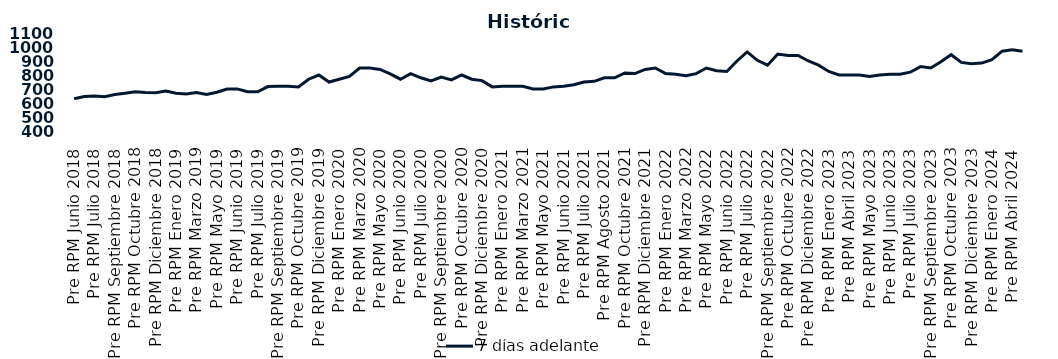
| Category | 7 días adelante  |
|---|---|
| Pre RPM Junio 2018 | 630 |
| Post RPM Junio 2018 | 646.5 |
| Pre RPM Julio 2018 | 650 |
| Post RPM Julio 2018 | 645 |
| Pre RPM Septiembre 2018 | 660 |
| Post RPM Septiembre 2018 | 670 |
| Pre RPM Octubre 2018 | 680 |
| Post RPM Octubre 2018 | 675 |
| Pre RPM Diciembre 2018 | 672.5 |
| Post RPM Diciembre 2018 | 685 |
| Pre RPM Enero 2019 | 670 |
| Post RPM Enero 2019 | 665 |
| Pre RPM Marzo 2019 | 675 |
| Post RPM Marzo 2019 | 661 |
| Pre RPM Mayo 2019 | 677 |
| Post RPM Mayo 2019 | 700 |
| Pre RPM Junio 2019 | 700.5 |
| Post RPM Junio 2019 | 680 |
| Pre RPM Julio 2019 | 680 |
| Post RPM Julio 2019 | 717.5 |
| Pre RPM Septiembre 2019 | 720 |
| Post RPM Septiembre 2019 | 720 |
| Pre RPM Octubre 2019 | 715 |
| Post RPM Octubre 2019 | 770 |
| Pre RPM Diciembre 2019 | 800 |
| Post RPM Diciembre 2019 | 750 |
| Pre RPM Enero 2020 | 770 |
| Post RPM Enero 2020 | 790 |
| Pre RPM Marzo 2020 | 850 |
| Post RPM Marzo 2020 | 850 |
| Pre RPM Mayo 2020 | 840 |
| Post RPM Mayo 2020 | 808.5 |
| Pre RPM Junio 2020 | 770 |
| Post RPM Junio 2020 | 810 |
| Pre RPM Julio 2020 | 780 |
| Post RPM Julio 2020 | 757 |
| Pre RPM Septiembre 2020 | 785 |
| Post RPM Septiembre 2020 | 765 |
| Pre RPM Octubre 2020 | 800 |
| Post RPM Octubre 2020 | 770 |
| Pre RPM Diciembre 2020 | 760 |
| Post RPM Diciembre 2020 | 715 |
| Pre RPM Enero 2021 | 720 |
| Post RPM Enero 2021 | 720 |
| Pre RPM Marzo 2021 | 720 |
| Post RPM Marzo 2021 | 700 |
| Pre RPM Mayo 2021 | 700 |
| Post RPM Mayo 2021 | 715 |
| Pre RPM Junio 2021 | 720 |
| Post RPM Junio 2021 | 730 |
| Pre RPM Julio 2021 | 750 |
| Post RPM Julio 2021 | 755 |
| Pre RPM Agosto 2021 | 780 |
| Post RPM Agosto 2021 | 780 |
| Pre RPM Octubre 2021 | 815 |
| Post RPM Octubre 2021 | 810 |
| Pre RPM Diciembre 2021 | 840 |
| Post RPM Diciembre 2021 | 850 |
| Pre RPM Enero 2022 | 810 |
| Post RPM Enero 2022 | 805 |
| Pre RPM Marzo 2022 | 795 |
| Post RPM Marzo 2022 | 810 |
| Pre RPM Mayo 2022 | 850 |
| Post RPM Mayo 2022 | 830 |
| Pre RPM Junio 2022 | 825 |
| Post RPM Junio 2022 | 900 |
| Pre RPM Julio 2022 | 965 |
| Post RPM Julio 2022 | 905 |
| Pre RPM Septiembre 2022 | 870 |
| Post RPM Septiembre 2022 | 950 |
| Pre RPM Octubre 2022 | 940 |
| Post RPM Octubre 2022 | 940 |
| Pre RPM Diciembre 2022 | 900 |
| Post RPM Diciembre 2022 | 870 |
| Pre RPM Enero 2023 | 825 |
| Post RPM Enero 2023 | 800 |
| Pre RPM Abril 2023 | 800 |
| Post RPM Abril 2023 | 800 |
| Pre RPM Mayo 2023 | 790 |
| Post RPM Mayo 2023 | 800 |
| Pre RPM Junio 2023 | 805 |
| Post RPM Junio 2023 | 805 |
| Pre RPM Julio 2023 | 820 |
| Post RPM Julio 2023 | 860 |
| Pre RPM Septiembre 2023 | 850 |
| Post RPM Septiembre 2023 | 895 |
| Pre RPM Octubre 2023 | 945 |
| Post RPM Octubre 2023 | 890 |
| Pre RPM Diciembre 2023 | 880 |
| Post RPM Diciembre 2023 | 885 |
| Pre RPM Enero 2024 | 910 |
| Post RPM Enero 2024 | 970 |
| Pre RPM Abril 2024 | 980 |
| Post RPM Abril 2024 | 970 |